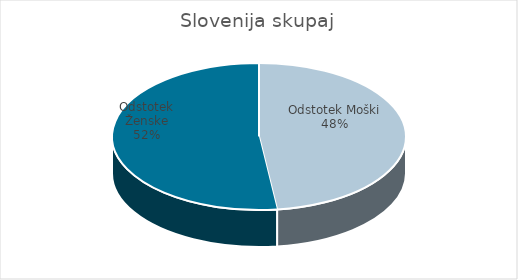
| Category | Slovenija skupaj |
|---|---|
| Odstotek Moški | 19.85 |
| Odstotek Ženske | 21.47 |